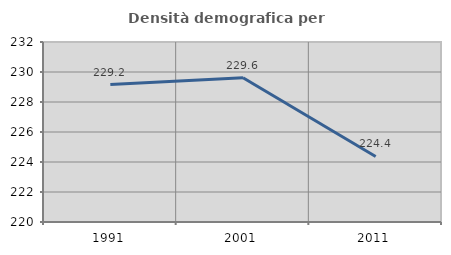
| Category | Densità demografica |
|---|---|
| 1991.0 | 229.165 |
| 2001.0 | 229.619 |
| 2011.0 | 224.37 |